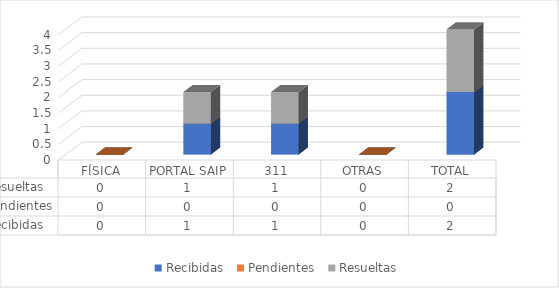
| Category | Recibidas  | Pendientes  | Resueltas |
|---|---|---|---|
| FÍSICA | 0 | 0 | 0 |
| PORTAL SAIP | 1 | 0 | 1 |
| 311 | 1 | 0 | 1 |
| OTRAS | 0 | 0 | 0 |
| TOTAL | 2 | 0 | 2 |